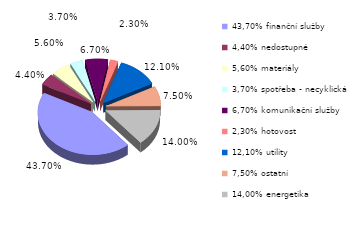
| Category | Series 0 |
|---|---|
| 43,70% finanční služby | 0.437 |
| 4,40% nedostupné | 0.044 |
| 5,60% materiály | 0.056 |
| 3,70% spotřeba - necyklická | 0.037 |
| 6,70% komunikační služby | 0.067 |
| 2,30% hotovost | 0.023 |
| 12,10% utility | 0.121 |
| 7,50% ostatní | 0.075 |
| 14,00% energetika | 0.14 |